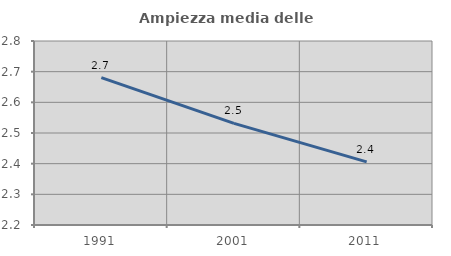
| Category | Ampiezza media delle famiglie |
|---|---|
| 1991.0 | 2.681 |
| 2001.0 | 2.531 |
| 2011.0 | 2.406 |